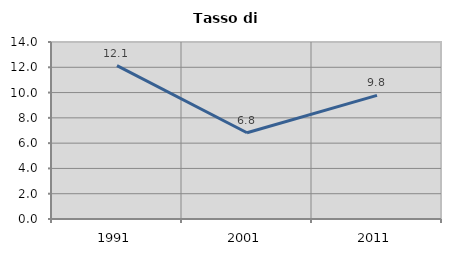
| Category | Tasso di disoccupazione   |
|---|---|
| 1991.0 | 12.134 |
| 2001.0 | 6.82 |
| 2011.0 | 9.779 |